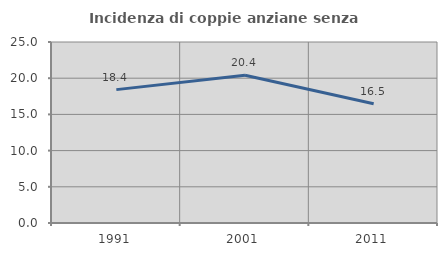
| Category | Incidenza di coppie anziane senza figli  |
|---|---|
| 1991.0 | 18.421 |
| 2001.0 | 20.408 |
| 2011.0 | 16.471 |